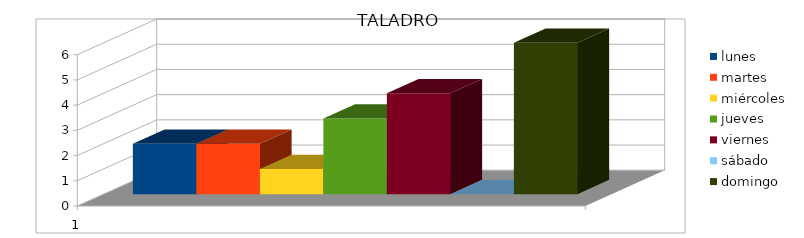
| Category | lunes | martes | miércoles | jueves | viernes | sábado | domingo |
|---|---|---|---|---|---|---|---|
| 0 | 2 | 2 | 1 | 3 | 4 | 0 | 6 |